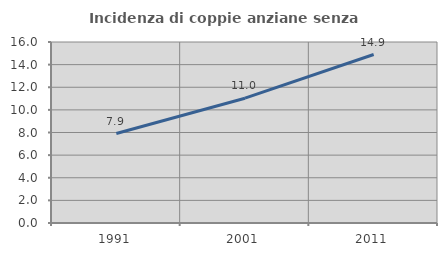
| Category | Incidenza di coppie anziane senza figli  |
|---|---|
| 1991.0 | 7.911 |
| 2001.0 | 11.032 |
| 2011.0 | 14.894 |